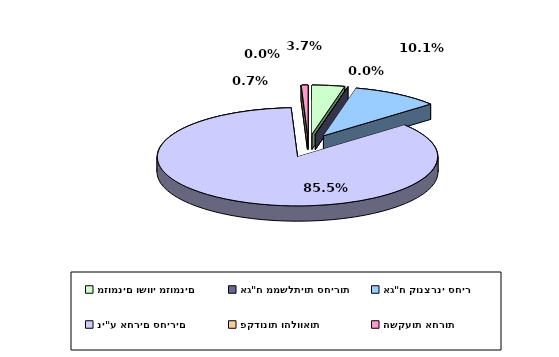
| Category | Series 0 |
|---|---|
| מזומנים ושווי מזומנים | 0.037 |
| אג"ח ממשלתיות סחירות | 0 |
| אג"ח קונצרני סחיר | 0.101 |
| ני"ע אחרים סחירים | 0.855 |
| פקדונות והלוואות | 0 |
| השקעות אחרות | 0.007 |